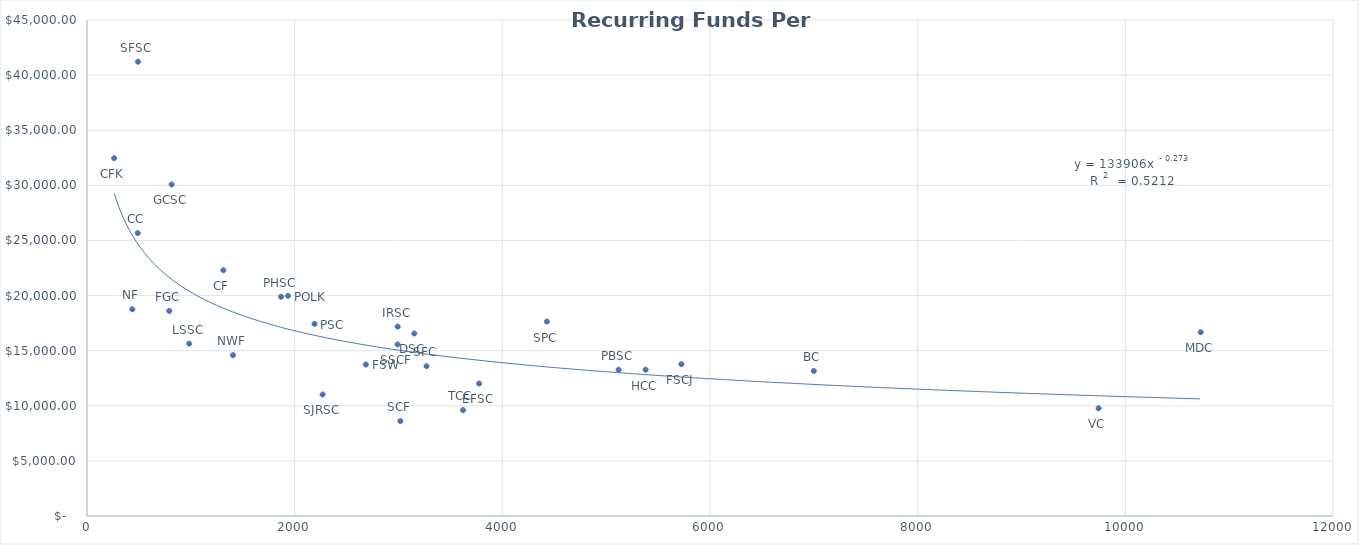
| Category |  Recurring Funds Per Graduate |
|---|---|
| 491.0 | 41215.456 |
| 261.0 | 32470.716 |
| 815.0 | 30080.427 |
| 489.0 | 25670.922 |
| 1313.0 | 22303.872 |
| 1936.0 | 19972.671 |
| 1869.0 | 19889.444 |
| 436.0 | 18765.172 |
| 792.0 | 18611.658 |
| 4429.0 | 17642.105 |
| 2191.0 | 17439.127 |
| 2992.0 | 17186.822 |
| 10726.0 | 16679.652 |
| 3152.0 | 16561.318 |
| 984.0 | 15639.487 |
| 2991.0 | 15570.356 |
| 1406.0 | 14598.214 |
| 5724.0 | 13779.994 |
| 2686.0 | 13745.897 |
| 3270.0 | 13594.068 |
| 5380.0 | 13276.685 |
| 5120.0 | 13274.709 |
| 7000.0 | 13163.646 |
| 3776.0 | 12021.338 |
| 2269.0 | 11024.028 |
| 9742.0 | 9772.261 |
| 3621.0 | 9609.498 |
| 3018.0 | 8619.834 |